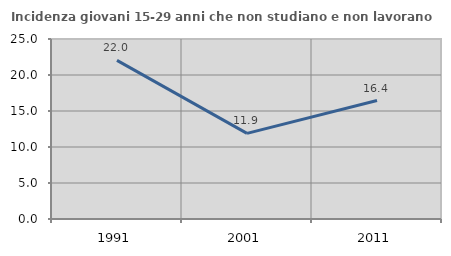
| Category | Incidenza giovani 15-29 anni che non studiano e non lavorano  |
|---|---|
| 1991.0 | 22.034 |
| 2001.0 | 11.888 |
| 2011.0 | 16.449 |